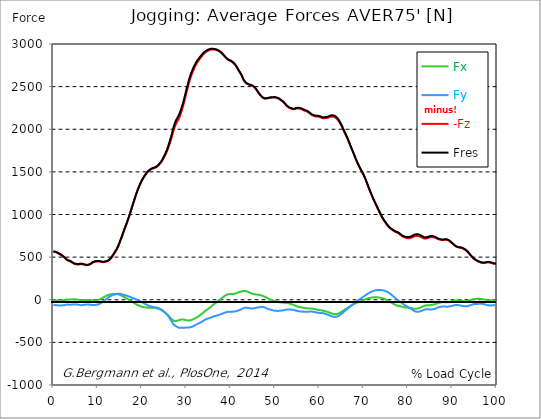
| Category |  Fx |  Fy |  -Fz |  Fres |
|---|---|---|---|---|
| 0.0 | -3.887 | -58.917 | 563.54 | 567.454 |
| 0.167348456675344 | -5.373 | -60.73 | 562.452 | 566.584 |
| 0.334696913350688 | -6.86 | -62.551 | 561.365 | 565.705 |
| 0.5020453700260321 | -7.92 | -64.128 | 559.099 | 563.694 |
| 0.669393826701376 | -8.663 | -65.414 | 556.127 | 560.93 |
| 0.83674228337672 | -8.5 | -65.849 | 551.452 | 556.345 |
| 1.0040907400520642 | -8.182 | -65.723 | 546.169 | 551.098 |
| 1.1621420602454444 | -8.119 | -66.013 | 541.221 | 546.25 |
| 1.3294905169207885 | -8.128 | -66.339 | 536.482 | 541.62 |
| 1.4968389735961325 | -7.847 | -66.339 | 531.571 | 536.763 |
| 1.6641874302714765 | -7.394 | -66.23 | 526.279 | 531.516 |
| 1.8315358869468206 | -6.86 | -66.185 | 520.489 | 525.781 |
| 1.9988843436221646 | -6.252 | -66.067 | 514.245 | 519.601 |
| 2.1662328002975086 | -5.564 | -65.732 | 506.779 | 512.152 |
| 2.333581256972853 | -4.73 | -64.807 | 500.554 | 505.882 |
| 2.5009297136481967 | -3.833 | -63.874 | 494.419 | 499.675 |
| 2.6682781703235405 | -2.138 | -61.799 | 486.445 | 491.519 |
| 2.8356266269988843 | 0.734 | -58.664 | 476.586 | 481.398 |
| 3.002975083674229 | 2.637 | -56.743 | 468.857 | 473.541 |
| 3.1703235403495724 | 3.516 | -56.09 | 463.202 | 467.842 |
| 3.337671997024917 | 3.851 | -56.036 | 458.898 | 463.574 |
| 3.4957233172182973 | 3.588 | -56.552 | 455.69 | 460.457 |
| 3.663071773893641 | 2.456 | -58.147 | 453.996 | 458.989 |
| 3.8304202305689854 | 2.365 | -58.446 | 450.244 | 455.319 |
| 3.997768687244329 | 3.262 | -57.504 | 444.962 | 449.955 |
| 4.165117143919673 | 4.06 | -56.833 | 439.226 | 444.164 |
| 4.332465600595017 | 5.518 | -55.773 | 432.919 | 437.803 |
| 4.499814057270361 | 6.415 | -54.785 | 427.464 | 432.248 |
| 4.667162513945706 | 6.579 | -54.169 | 423.359 | 428.089 |
| 4.834510970621049 | 6.216 | -54.124 | 420.296 | 425.008 |
| 5.001859427296393 | 5.555 | -54.459 | 417.814 | 422.544 |
| 5.169207883971737 | 4.73 | -55.166 | 415.757 | 420.559 |
| 5.336556340647081 | 3.715 | -56.108 | 414.425 | 419.336 |
| 5.503904797322425 | 2.501 | -57.033 | 413.808 | 418.792 |
| 5.671253253997769 | 1.124 | -58.473 | 413.645 | 418.819 |
| 5.82930457419115 | -0.661 | -60.449 | 414.923 | 420.378 |
| 5.996653030866494 | -2.664 | -62.578 | 416.926 | 422.707 |
| 6.164001487541838 | -4.395 | -63.792 | 417.768 | 423.704 |
| 6.331349944217181 | -5.464 | -64.019 | 417.442 | 423.405 |
| 6.498698400892526 | -5.754 | -63.303 | 416.627 | 422.471 |
| 6.66604685756787 | -5.808 | -62.243 | 415.648 | 421.329 |
| 6.833395314243213 | -5.319 | -60.802 | 413.219 | 418.693 |
| 7.000743770918558 | -4.214 | -58.836 | 409.405 | 414.633 |
| 7.168092227593902 | -3.407 | -57.377 | 406.677 | 411.697 |
| 7.335440684269246 | -3.108 | -56.58 | 405.626 | 410.555 |
| 7.50278914094459 | -3.081 | -56.099 | 405.889 | 410.709 |
| 7.6701375976199335 | -2.727 | -55.664 | 405.871 | 410.592 |
| 7.837486054295278 | -2.637 | -55.673 | 406.895 | 411.607 |
| 7.995537374488658 | -2.882 | -56.344 | 408.997 | 413.818 |
| 8.162885831164003 | -3.307 | -57.15 | 411.797 | 416.781 |
| 8.330234287839346 | -4.513 | -58.338 | 415.929 | 421.112 |
| 8.49758274451469 | -6.107 | -60.014 | 421.184 | 426.612 |
| 8.664931201190035 | -7.938 | -61.826 | 428.189 | 433.798 |
| 8.832279657865378 | -9.551 | -63.403 | 435.139 | 440.875 |
| 8.999628114540721 | -9.288 | -63.312 | 439.371 | 445.089 |
| 9.166976571216066 | -8.164 | -62.189 | 442.506 | 448.124 |
| 9.334325027891412 | -7.53 | -60.82 | 445.025 | 450.489 |
| 9.501673484566755 | -7.385 | -59.987 | 447.082 | 452.374 |
| 9.669021941242098 | -6.669 | -59.407 | 448.523 | 453.679 |
| 9.836370397917442 | -5.21 | -57.83 | 449.112 | 454.077 |
| 10.003718854592787 | -3.172 | -55.547 | 449.157 | 453.905 |
| 10.17106731126813 | -0.544 | -52.167 | 449.692 | 454.159 |
| 10.329118631461512 | 1.803 | -49.466 | 449.474 | 453.679 |
| 10.496467088136853 | 4.703 | -46.204 | 448.722 | 452.637 |
| 10.663815544812199 | 8.463 | -41.927 | 447.29 | 450.997 |
| 10.831164001487544 | 13.556 | -36.146 | 444.753 | 448.414 |
| 10.998512458162887 | 18.676 | -29.948 | 442.805 | 446.529 |
| 11.16586091483823 | 24.085 | -22.808 | 441.663 | 445.777 |
| 11.333209371513574 | 29.866 | -14.969 | 441.102 | 445.931 |
| 11.50055782818892 | 34.234 | -8.88 | 442.388 | 447.408 |
| 11.667906284864264 | 38.448 | -2.646 | 443.965 | 449.103 |
| 11.835254741539607 | 42.779 | 3.942 | 445.877 | 451.441 |
| 12.00260319821495 | 46.875 | 10.475 | 448.151 | 454.259 |
| 12.169951654890292 | 51.007 | 17.244 | 450.498 | 457.412 |
| 12.337300111565641 | 54.876 | 23.668 | 453.724 | 461.463 |
| 12.504648568240984 | 57.631 | 29.06 | 459.188 | 467.461 |
| 12.662699888434362 | 60.748 | 35.131 | 465.767 | 474.448 |
| 12.830048345109708 | 63.403 | 40.804 | 473.732 | 482.703 |
| 12.997396801785053 | 64.762 | 45.217 | 484.152 | 493.386 |
| 13.164745258460396 | 66.411 | 50.309 | 495.452 | 505.048 |
| 13.33209371513574 | 67.281 | 54.088 | 507.449 | 517.272 |
| 13.499442171811083 | 67.336 | 56.498 | 520.271 | 530.157 |
| 13.666790628486426 | 66.91 | 58.51 | 534.543 | 544.275 |
| 13.834139085161771 | 66.529 | 60.53 | 548.579 | 558.175 |
| 14.001487541837117 | 66.293 | 62.759 | 562.697 | 572.148 |
| 14.16883599851246 | 66.402 | 65.405 | 576.742 | 586.121 |
| 14.336184455187803 | 66.375 | 68.495 | 591.548 | 600.891 |
| 14.503532911863147 | 65.605 | 70.471 | 608.738 | 617.926 |
| 14.670881368538492 | 63.648 | 71.268 | 628.274 | 637.127 |
| 14.828932688731873 | 60.585 | 70.851 | 650.847 | 659.21 |
| 14.996281145407215 | 57.576 | 70.398 | 673.953 | 681.8 |
| 15.163629602082558 | 53.562 | 68.595 | 697.694 | 704.735 |
| 15.330978058757903 | 49.403 | 66.23 | 721.027 | 727.452 |
| 15.498326515433247 | 44.918 | 63.711 | 745.394 | 751.211 |
| 15.665674972108594 | 40.26 | 60.866 | 770.222 | 775.387 |
| 15.833023428783937 | 35.34 | 57.676 | 795.385 | 799.853 |
| 16.00037188545928 | 30.193 | 54.432 | 820.54 | 824.346 |
| 16.167720342134626 | 25.734 | 52.303 | 844.589 | 848.023 |
| 16.335068798809967 | 22.101 | 51.387 | 866.925 | 870.16 |
| 16.502417255485312 | 17.706 | 49.258 | 890.059 | 893.122 |
| 16.669765712160658 | 12.731 | 46.367 | 914 | 916.872 |
| 16.837114168836 | 7.177 | 43.132 | 939.517 | 942.099 |
| 17.004462625511344 | 1.64 | 39.372 | 964.707 | 967.1 |
| 17.16251394570472 | -3.951 | 35.711 | 989.862 | 992.127 |
| 17.32986240238007 | -9.705 | 32.041 | 1015.941 | 1018.115 |
| 17.497210859055414 | -15.685 | 28.652 | 1043.759 | 1045.853 |
| 17.664559315730756 | -20.823 | 25.662 | 1072.212 | 1074.305 |
| 17.8319077724061 | -26.088 | 22.672 | 1100.837 | 1102.949 |
| 17.999256229081443 | -31.588 | 19.201 | 1128.583 | 1130.785 |
| 18.166604685756788 | -36.962 | 15.731 | 1155.722 | 1157.961 |
| 18.333953142432133 | -42.326 | 12.45 | 1182.626 | 1184.936 |
| 18.501301599107478 | -47.518 | 8.744 | 1208.931 | 1211.323 |
| 18.668650055782823 | -52.629 | 4.549 | 1235.291 | 1237.783 |
| 18.835998512458165 | -57.703 | 0.362 | 1260.563 | 1263.2 |
| 19.00334696913351 | -62.334 | -3.579 | 1283.86 | 1286.651 |
| 19.170695425808855 | -66.04 | -6.914 | 1305.29 | 1308.263 |
| 19.338043882484197 | -69.764 | -11.381 | 1325.597 | 1328.769 |
| 19.496095202677576 | -73.271 | -15.803 | 1346.003 | 1349.365 |
| 19.66344365935292 | -76.696 | -20.515 | 1365.395 | 1369.001 |
| 19.830792116028263 | -80.167 | -24.792 | 1383.581 | 1387.342 |
| 19.998140572703612 | -83.057 | -29.259 | 1400.562 | 1404.513 |
| 20.165489029378953 | -84.915 | -33.509 | 1415.622 | 1419.709 |
| 20.3328374860543 | -86.727 | -37.913 | 1429.867 | 1434.135 |
| 20.500185942729644 | -88.113 | -41.755 | 1444.211 | 1448.633 |
| 20.667534399404985 | -89.409 | -46.358 | 1457.722 | 1462.325 |
| 20.83488285608033 | -90.805 | -52.212 | 1470.399 | 1475.283 |
| 21.002231312755672 | -91.883 | -57.613 | 1482.632 | 1487.742 |
| 21.16957976943102 | -92.264 | -61.998 | 1492.962 | 1498.145 |
| 21.336928226106362 | -92.381 | -66.058 | 1501.824 | 1507.043 |
| 21.504276682781704 | -92.372 | -69.311 | 1509.327 | 1514.628 |
| 21.67162513945705 | -92.399 | -72.392 | 1516.503 | 1521.931 |
| 21.82967645965043 | -92.925 | -75.436 | 1523.299 | 1528.827 |
| 21.997024916325774 | -93.097 | -78.563 | 1529.18 | 1534.807 |
| 22.16437337300112 | -92.825 | -81.335 | 1534.083 | 1539.773 |
| 22.33172182967646 | -92.807 | -82.994 | 1538.115 | 1543.869 |
| 22.499070286351806 | -93.297 | -84.724 | 1540.752 | 1546.633 |
| 22.666418743027148 | -93.931 | -86.183 | 1542.917 | 1548.907 |
| 22.833767199702496 | -94.728 | -87.524 | 1545.246 | 1551.345 |
| 23.00111565637784 | -96.423 | -88.295 | 1549.17 | 1555.413 |
| 23.168464113053183 | -98.779 | -90.288 | 1553.791 | 1560.279 |
| 23.335812569728528 | -101.434 | -92.2 | 1558.712 | 1565.471 |
| 23.50316102640387 | -104.206 | -93.659 | 1564.828 | 1571.878 |
| 23.670509483079215 | -106.599 | -96.93 | 1573.618 | 1580.994 |
| 23.83785793975456 | -109.381 | -101.615 | 1582.86 | 1590.617 |
| 23.995909259947936 | -112.307 | -106.01 | 1592.529 | 1600.693 |
| 24.163257716623285 | -115.832 | -109.462 | 1602.17 | 1610.724 |
| 24.330606173298627 | -120.626 | -113.839 | 1613.769 | 1622.939 |
| 24.49795462997397 | -125.709 | -119.194 | 1627.361 | 1637.211 |
| 24.665303086649313 | -131.21 | -125.8 | 1641.805 | 1652.543 |
| 24.83265154332466 | -137.19 | -133.448 | 1657.282 | 1669.053 |
| 25.0 | -143.624 | -141.458 | 1673.746 | 1686.632 |
| 25.167348456675345 | -150.465 | -148.888 | 1690.592 | 1704.637 |
| 25.334696913350694 | -157.506 | -156.428 | 1707.292 | 1722.551 |
| 25.502045370026035 | -165.154 | -164.846 | 1726.067 | 1742.713 |
| 25.669393826701377 | -172.983 | -174.251 | 1746.464 | 1764.633 |
| 25.836742283376722 | -180.912 | -185.397 | 1768.583 | 1788.509 |
| 26.004090740052067 | -189.493 | -197.449 | 1793.348 | 1815.195 |
| 26.17143919672741 | -198.708 | -211.557 | 1820.152 | 1844.274 |
| 26.329490516920792 | -208.495 | -225.195 | 1845.841 | 1872.282 |
| 26.49683897359613 | -218.226 | -238.733 | 1873.315 | 1902.14 |
| 26.66418743027148 | -227.324 | -253.186 | 1901.533 | 1932.876 |
| 26.831535886946828 | -234.782 | -267.783 | 1931.309 | 1964.999 |
| 26.998884343622166 | -240.527 | -280.814 | 1967.373 | 2002.975 |
| 27.166232800297514 | -247.431 | -291.66 | 1996.116 | 2033.476 |
| 27.333581256972852 | -250.395 | -299.435 | 2021.742 | 2060.09 |
| 27.5009297136482 | -251.065 | -305.805 | 2044.232 | 2083.16 |
| 27.668278170323543 | -250.313 | -310.807 | 2062.89 | 2102.126 |
| 27.835626626998888 | -248.736 | -315.501 | 2080.478 | 2119.922 |
| 28.002975083674233 | -245.184 | -320.829 | 2095.638 | 2135.191 |
| 28.170323540349575 | -241.514 | -326.058 | 2110.743 | 2150.378 |
| 28.33767199702492 | -238.678 | -327.997 | 2128.83 | 2168.156 |
| 28.50502045370026 | -236.268 | -329.193 | 2149.535 | 2188.436 |
| 28.663071773893645 | -234.075 | -328.83 | 2173.648 | 2211.851 |
| 28.830420230568986 | -232.834 | -330.48 | 2199.101 | 2237.023 |
| 28.99776868724433 | -232.054 | -329.827 | 2227.681 | 2264.969 |
| 29.165117143919673 | -231.311 | -329.465 | 2255.681 | 2292.416 |
| 29.33246560059502 | -232.589 | -329.99 | 2286.508 | 2322.944 |
| 29.499814057270367 | -234.021 | -329.039 | 2319.754 | 2355.683 |
| 29.66716251394571 | -235.806 | -328.377 | 2354.224 | 2389.681 |
| 29.834510970621054 | -237.917 | -326.692 | 2390.062 | 2424.903 |
| 30.00185942729639 | -240.11 | -325.278 | 2426.108 | 2460.378 |
| 30.169207883971744 | -241.487 | -325.034 | 2459.789 | 2493.634 |
| 30.33655634064708 | -242.874 | -324.372 | 2494.205 | 2527.578 |
| 30.50390479732243 | -243.78 | -324.245 | 2528.176 | 2561.169 |
| 30.671253253997772 | -243.816 | -324.227 | 2559.891 | 2592.467 |
| 30.829304574191156 | -241.46 | -323.076 | 2587.701 | 2619.561 |
| 30.996653030866494 | -239.032 | -321.201 | 2613.888 | 2645.023 |
| 31.164001487541842 | -236.213 | -318.455 | 2638.091 | 2668.42 |
| 31.331349944217187 | -232.96 | -315.528 | 2661.026 | 2690.457 |
| 31.498698400892525 | -229.553 | -312.275 | 2682.039 | 2710.619 |
| 31.666046857567874 | -226.028 | -308.17 | 2702.201 | 2729.866 |
| 31.833395314243212 | -222.204 | -302.842 | 2722.018 | 2748.605 |
| 32.00074377091856 | -217.221 | -296.889 | 2739.516 | 2764.888 |
| 32.1680922275939 | -211.757 | -292.965 | 2756.66 | 2780.999 |
| 32.33544068426925 | -207.09 | -288.942 | 2771.902 | 2795.38 |
| 32.50278914094459 | -201.943 | -284.792 | 2786.345 | 2808.945 |
| 32.670137597619934 | -196.842 | -280.923 | 2799.294 | 2821.069 |
| 32.83748605429528 | -190.743 | -276.845 | 2811.273 | 2832.16 |
| 33.004834510970625 | -184.699 | -272.224 | 2823.561 | 2843.55 |
| 33.162885831164004 | -177.767 | -267.285 | 2835.721 | 2854.687 |
| 33.33023428783935 | -170.835 | -262.473 | 2847.429 | 2865.434 |
| 33.497582744514695 | -164.03 | -257.807 | 2858.42 | 2875.582 |
| 33.664931201190036 | -157.551 | -253.213 | 2869.004 | 2885.36 |
| 33.83227965786538 | -150.936 | -248.301 | 2879.243 | 2894.738 |
| 33.99962811454073 | -143.125 | -241.487 | 2888.332 | 2902.875 |
| 34.16697657121607 | -135.115 | -234.863 | 2895.989 | 2909.617 |
| 34.33432502789141 | -128.165 | -229.861 | 2902.866 | 2915.752 |
| 34.50167348456676 | -122.674 | -227.197 | 2909.78 | 2922.158 |
| 34.6690219412421 | -116.648 | -223.79 | 2915.181 | 2927.06 |
| 34.83637039791744 | -110.241 | -220.637 | 2920.183 | 2931.555 |
| 35.00371885459279 | -104.216 | -218.154 | 2924.405 | 2935.37 |
| 35.17106731126814 | -98.289 | -216.731 | 2928.247 | 2938.858 |
| 35.338415767943474 | -90.732 | -213.37 | 2931.736 | 2941.767 |
| 35.49646708813686 | -83.22 | -209.962 | 2933.956 | 2943.498 |
| 35.6638155448122 | -75.935 | -206.51 | 2934.844 | 2943.96 |
| 35.831164001487544 | -68.604 | -202.668 | 2934.953 | 2943.643 |
| 35.998512458162885 | -61.047 | -198.699 | 2934.998 | 2943.262 |
| 36.165860914838234 | -53.671 | -194.785 | 2934.98 | 2942.845 |
| 36.333209371513576 | -48.162 | -191.831 | 2934.482 | 2942.084 |
| 36.50055782818892 | -42.562 | -189.71 | 2933.204 | 2940.562 |
| 36.667906284864266 | -36.228 | -188.242 | 2931.211 | 2938.324 |
| 36.83525474153961 | -28.833 | -185.533 | 2928.365 | 2935.152 |
| 37.002603198214956 | -21.512 | -182.724 | 2924.65 | 2931.202 |
| 37.1699516548903 | -14.68 | -180.359 | 2920.699 | 2927.106 |
| 37.337300111565646 | -8.599 | -177.523 | 2916.305 | 2922.611 |
| 37.50464856824098 | -1.658 | -174.704 | 2911.312 | 2917.455 |
| 37.66269988843437 | 5.446 | -171.578 | 2905.05 | 2911.013 |
| 37.83004834510971 | 12.296 | -168.081 | 2897.683 | 2903.492 |
| 37.99739680178505 | 18.92 | -165.48 | 2889.573 | 2895.291 |
| 38.16474525846039 | 25.644 | -162.426 | 2880.693 | 2886.329 |
| 38.33209371513574 | 32.503 | -158.738 | 2871.333 | 2876.869 |
| 38.49944217181109 | 39 | -155.268 | 2861.737 | 2867.192 |
| 38.666790628486424 | 45.235 | -152.033 | 2851.769 | 2857.17 |
| 38.83413908516178 | 51.261 | -148.807 | 2841.847 | 2847.211 |
| 39.001487541837115 | 56.688 | -146.188 | 2832.686 | 2838.05 |
| 39.16883599851246 | 60.63 | -143.941 | 2824.476 | 2829.858 |
| 39.336184455187805 | 62.986 | -141.929 | 2817.616 | 2822.999 |
| 39.503532911863154 | 65.759 | -140.778 | 2811.754 | 2817.191 |
| 39.670881368538495 | 67.127 | -141.023 | 2807.431 | 2812.914 |
| 39.83822982521384 | 66.529 | -142.455 | 2804.468 | 2809.987 |
| 39.996281145407224 | 65.94 | -143.216 | 2800.989 | 2806.534 |
| 40.163629602082565 | 65.877 | -142.011 | 2795.778 | 2801.27 |
| 40.33097805875791 | 67.118 | -140.271 | 2789.426 | 2794.854 |
| 40.498326515433256 | 67.97 | -139.184 | 2782.666 | 2788.094 |
| 40.6656749721086 | 69.302 | -139.147 | 2774.819 | 2780.229 |
| 40.83302342878393 | 70.389 | -138.794 | 2765.667 | 2771.023 |
| 41.00037188545929 | 72.22 | -137.571 | 2755.419 | 2760.747 |
| 41.16772034213463 | 74.829 | -135.613 | 2744.065 | 2749.384 |
| 41.33506879880997 | 77.566 | -132.913 | 2731.107 | 2736.399 |
| 41.50241725548531 | 81.607 | -129.905 | 2716.255 | 2721.511 |
| 41.66976571216066 | 85.658 | -126.643 | 2700.398 | 2705.59 |
| 41.837114168836 | 88.983 | -123.19 | 2685.12 | 2690.24 |
| 42.004462625511344 | 91.493 | -119.991 | 2671.102 | 2676.177 |
| 42.17181108218669 | 93.378 | -116.92 | 2657.437 | 2662.448 |
| 42.32986240238007 | 95.036 | -113.866 | 2643.737 | 2648.675 |
| 42.497210859055414 | 96.74 | -110.54 | 2627.77 | 2632.636 |
| 42.66455931573076 | 100.056 | -105.185 | 2606.748 | 2611.505 |
| 42.831907772406105 | 103.346 | -100.056 | 2586.033 | 2590.7 |
| 42.999256229081446 | 104.061 | -96.83 | 2570.72 | 2575.305 |
| 43.16660468575679 | 103.744 | -94.592 | 2558.777 | 2563.262 |
| 43.33395314243214 | 103.518 | -92.064 | 2547.812 | 2552.189 |
| 43.50130159910748 | 101.198 | -92.191 | 2540.128 | 2544.414 |
| 43.66865005578282 | 98.19 | -93.632 | 2533.912 | 2538.144 |
| 43.83599851245817 | 94.411 | -96.187 | 2529.363 | 2533.55 |
| 44.00334696913351 | 91.122 | -97.41 | 2524.932 | 2529.073 |
| 44.17069542580886 | 87.153 | -98.924 | 2521.915 | 2526.065 |
| 44.3380438824842 | 82.976 | -100.256 | 2519.341 | 2523.473 |
| 44.49609520267758 | 78.735 | -101.144 | 2516.904 | 2521.018 |
| 44.66344365935292 | 74.657 | -102.177 | 2514.367 | 2518.444 |
| 44.83079211602827 | 71.141 | -103.79 | 2511.567 | 2515.726 |
| 44.99814057270361 | 68.423 | -103.028 | 2507.063 | 2511.168 |
| 45.16548902937895 | 66.457 | -101.425 | 2500.412 | 2504.381 |
| 45.332837486054295 | 64.717 | -99.096 | 2492.483 | 2496.307 |
| 45.500185942729644 | 63.376 | -97.057 | 2483.313 | 2487.037 |
| 45.66753439940499 | 62.279 | -95.435 | 2472.956 | 2476.589 |
| 45.83488285608033 | 61.128 | -93.913 | 2461.52 | 2465.072 |
| 46.00223131275568 | 60.24 | -92.218 | 2448.327 | 2451.797 |
| 46.16957976943102 | 59.407 | -90.478 | 2434.816 | 2438.196 |
| 46.336928226106366 | 57.948 | -89.183 | 2422.774 | 2426.081 |
| 46.50427668278171 | 56.552 | -87.552 | 2411.139 | 2414.355 |
| 46.671625139457056 | 54.432 | -85.866 | 2400.356 | 2403.482 |
| 46.829676459650436 | 52.04 | -84.362 | 2390.107 | 2393.143 |
| 46.99702491632577 | 49.729 | -83.338 | 2380.964 | 2383.927 |
| 47.16437337300112 | 46.748 | -83.836 | 2373.688 | 2376.606 |
| 47.33172182967646 | 43.441 | -85.023 | 2367.281 | 2370.163 |
| 47.49907028635181 | 39.544 | -87.271 | 2363.013 | 2365.922 |
| 47.66641874302716 | 35.548 | -90.016 | 2360.059 | 2363.032 |
| 47.83376719970249 | 31.869 | -93.387 | 2358.682 | 2361.826 |
| 48.001115656377834 | 27.338 | -97.7 | 2359.615 | 2362.995 |
| 48.16846411305319 | 22.264 | -102.367 | 2360.875 | 2364.49 |
| 48.33581256972853 | 17.353 | -106.173 | 2363.104 | 2366.937 |
| 48.50316102640387 | 12.985 | -109.063 | 2365.07 | 2369.112 |
| 48.67050948307921 | 9.098 | -111.256 | 2366.611 | 2370.824 |
| 48.837857939754564 | 5.537 | -114.038 | 2368.332 | 2372.8 |
| 49.005206396429905 | 1.975 | -116.82 | 2369.737 | 2374.467 |
| 49.163257716623285 | -1.83 | -119.547 | 2370.67 | 2375.654 |
| 49.33060617329863 | -5.917 | -122.202 | 2371.123 | 2376.343 |
| 49.49795462997397 | -9.324 | -123.779 | 2370.87 | 2376.225 |
| 49.66530308664932 | -12.804 | -125.519 | 2371.151 | 2376.696 |
| 49.832651543324666 | -16.211 | -127.195 | 2372.057 | 2377.811 |
| 50.0 | -18.712 | -128.292 | 2371.413 | 2377.321 |
| 50.16734845667534 | -20.696 | -129.044 | 2369.809 | 2375.817 |
| 50.33469691335069 | -22.327 | -129.823 | 2367.182 | 2373.289 |
| 50.50204537002604 | -24.14 | -131.155 | 2364.074 | 2370.317 |
| 50.66939382670139 | -26.287 | -131.871 | 2361.745 | 2368.097 |
| 50.836742283376715 | -27.918 | -131.364 | 2357.848 | 2364.2 |
| 51.00409074005207 | -28.707 | -129.696 | 2352.33 | 2358.564 |
| 51.17143919672741 | -29.812 | -128.672 | 2346.295 | 2352.457 |
| 51.32949051692079 | -30.718 | -127.739 | 2339.544 | 2345.652 |
| 51.496838973596134 | -32.377 | -127.041 | 2332.83 | 2338.856 |
| 51.66418743027148 | -33.21 | -126.543 | 2327.157 | 2333.12 |
| 51.831535886946824 | -33.473 | -124.839 | 2320.144 | 2325.943 |
| 51.99888434362217 | -34.18 | -122.964 | 2312.306 | 2317.96 |
| 52.16623280029752 | -34.642 | -120.78 | 2303.081 | 2308.59 |
| 52.33358125697285 | -35.439 | -118.551 | 2291.627 | 2297.01 |
| 52.5009297136482 | -36.336 | -116.748 | 2281.75 | 2287.024 |
| 52.668278170323546 | -37.56 | -115.153 | 2272.544 | 2277.718 |
| 52.835626626998895 | -38.991 | -114.056 | 2264.09 | 2269.173 |
| 53.00297508367424 | -40.668 | -113.349 | 2257.466 | 2262.486 |
| 53.17032354034958 | -43.069 | -113.531 | 2252.274 | 2257.285 |
| 53.33767199702492 | -45.851 | -113.984 | 2248.567 | 2253.597 |
| 53.50502045370027 | -48.678 | -114.763 | 2246.148 | 2251.222 |
| 53.663071773893655 | -51.342 | -115.642 | 2241.998 | 2247.163 |
| 53.83042023056899 | -54.07 | -116.63 | 2238.319 | 2243.584 |
| 53.99776868724433 | -56.815 | -117.599 | 2235.809 | 2241.182 |
| 54.16511714391967 | -59.697 | -118.814 | 2234.731 | 2240.24 |
| 54.33246560059503 | -63.203 | -120.789 | 2235.727 | 2241.391 |
| 54.49981405727037 | -66.438 | -122.61 | 2237.83 | 2243.665 |
| 54.667162513945705 | -71.087 | -126.57 | 2241.672 | 2247.843 |
| 54.834510970621054 | -74.766 | -129.415 | 2244.254 | 2250.67 |
| 55.0018594272964 | -77.62 | -131.318 | 2245.052 | 2251.657 |
| 55.169207883971744 | -80.302 | -132.904 | 2244.608 | 2251.413 |
| 55.336556340647086 | -82.831 | -134.553 | 2244.01 | 2251.005 |
| 55.50390479732243 | -85.078 | -136.193 | 2243.14 | 2250.316 |
| 55.671253253997776 | -87.008 | -136.882 | 2241.962 | 2249.238 |
| 55.83860171067312 | -88.666 | -137.226 | 2239.515 | 2246.882 |
| 55.9966530308665 | -90.279 | -137.743 | 2235.791 | 2243.23 |
| 56.16400148754184 | -91.81 | -138.876 | 2231.586 | 2239.162 |
| 56.33134994421718 | -93.088 | -139.764 | 2227.146 | 2234.821 |
| 56.498698400892536 | -94.139 | -139.927 | 2222.126 | 2229.874 |
| 56.66604685756788 | -95.589 | -140.407 | 2218.629 | 2226.449 |
| 56.83339531424321 | -97.166 | -141.059 | 2216.254 | 2224.228 |
| 57.00074377091856 | -98.561 | -141.585 | 2213.491 | 2221.573 |
| 57.16809222759391 | -99.984 | -141.648 | 2210.084 | 2218.23 |
| 57.33544068426925 | -101.026 | -141.286 | 2205.952 | 2214.116 |
| 57.5027891409446 | -101.606 | -140.824 | 2199.899 | 2208.063 |
| 57.670137597619934 | -101.597 | -140.235 | 2193.157 | 2201.321 |
| 57.83748605429528 | -101.406 | -139.582 | 2186.089 | 2194.235 |
| 58.004834510970625 | -101.579 | -138.903 | 2179.556 | 2187.693 |
| 58.16288583116401 | -101.977 | -138.359 | 2173.14 | 2181.268 |
| 58.330234287839346 | -103.038 | -138.549 | 2166.29 | 2174.454 |
| 58.497582744514695 | -104.578 | -140.09 | 2161.777 | 2170.059 |
| 58.66493120119004 | -106.68 | -141.73 | 2158.542 | 2166.897 |
| 58.832279657865385 | -108.203 | -142.953 | 2155.434 | 2163.907 |
| 58.999628114540734 | -109.797 | -144.457 | 2152.788 | 2161.415 |
| 59.16697657121607 | -111.945 | -146.56 | 2150.94 | 2159.784 |
| 59.33432502789142 | -114.31 | -148.707 | 2149.843 | 2158.886 |
| 59.50167348456676 | -116.258 | -150.13 | 2149.29 | 2158.488 |
| 59.66902194124211 | -118.188 | -151.598 | 2148.538 | 2157.899 |
| 59.83637039791745 | -120.028 | -153.211 | 2146.889 | 2156.449 |
| 60.00371885459278 | -121.478 | -154.189 | 2145.022 | 2154.727 |
| 60.17106731126813 | -122.891 | -155.041 | 2142.839 | 2152.67 |
| 60.33841576794349 | -124.078 | -155.132 | 2138.843 | 2148.783 |
| 60.49646708813685 | -125.039 | -155.485 | 2134.765 | 2144.787 |
| 60.6638155448122 | -125.954 | -155.902 | 2130.66 | 2140.773 |
| 60.831164001487544 | -127.866 | -157.352 | 2128.449 | 2138.752 |
| 60.99851245816289 | -130.077 | -159.472 | 2128.15 | 2138.707 |
| 61.16586091483824 | -132.397 | -162.163 | 2129.428 | 2140.274 |
| 61.333209371513576 | -134.744 | -165.099 | 2130.905 | 2142.041 |
| 61.50055782818892 | -137.045 | -167.809 | 2131.811 | 2143.246 |
| 61.667906284864266 | -139.528 | -170.282 | 2132.835 | 2144.578 |
| 61.835254741539615 | -142.301 | -173.037 | 2134.221 | 2146.336 |
| 62.002603198214956 | -145.49 | -176.825 | 2136.396 | 2148.982 |
| 62.16995165489029 | -148.907 | -180.477 | 2139.649 | 2152.707 |
| 62.33730011156564 | -152.296 | -184.536 | 2143.292 | 2156.884 |
| 62.504648568240995 | -155.558 | -188.541 | 2146.726 | 2160.853 |
| 62.67199702491633 | -158.503 | -191.223 | 2148.33 | 2162.883 |
| 62.83004834510971 | -161.602 | -194.531 | 2149.481 | 2164.568 |
| 62.99739680178505 | -163.704 | -196.515 | 2148.366 | 2163.789 |
| 63.1647452584604 | -165.661 | -198.491 | 2146.644 | 2162.411 |
| 63.33209371513575 | -167.519 | -200.647 | 2144.107 | 2160.237 |
| 63.4994421718111 | -168.86 | -201.662 | 2140.211 | 2156.567 |
| 63.666790628486424 | -169.023 | -201.155 | 2134.919 | 2151.293 |
| 63.83413908516177 | -167.936 | -199.56 | 2128.177 | 2144.415 |
| 64.00148754183712 | -165.888 | -196.95 | 2120.013 | 2135.952 |
| 64.16883599851248 | -163.831 | -194.114 | 2109.973 | 2125.595 |
| 64.3361844551878 | -160.877 | -189.855 | 2098.057 | 2113.181 |
| 64.50353291186315 | -156.799 | -183.856 | 2084.855 | 2099.244 |
| 64.6708813685385 | -151.824 | -177.523 | 2070.402 | 2084.003 |
| 64.83822982521384 | -146.351 | -170.962 | 2055.015 | 2067.801 |
| 65.00557828188919 | -140.96 | -164.121 | 2038.243 | 2050.267 |
| 65.16362960208257 | -135.477 | -157.161 | 2021.062 | 2032.325 |
| 65.3309780587579 | -129.669 | -149.813 | 2002.513 | 2012.979 |
| 65.49832651543326 | -123.154 | -141.975 | 1983.077 | 1992.709 |
| 65.6656749721086 | -117.146 | -134.589 | 1964.428 | 1973.263 |
| 65.83302342878395 | -111.845 | -128.237 | 1947.103 | 1955.267 |
| 66.00037188545929 | -106.762 | -121.768 | 1929.741 | 1937.262 |
| 66.16772034213463 | -101.588 | -115.035 | 1911.527 | 1918.441 |
| 66.33506879880998 | -96.069 | -107.777 | 1892.172 | 1898.47 |
| 66.50241725548531 | -90.37 | -100.12 | 1871.766 | 1877.438 |
| 66.66976571216065 | -84.743 | -92.544 | 1851.097 | 1856.189 |
| 66.83711416883601 | -79.233 | -84.987 | 1829.83 | 1834.406 |
| 67.00446262551135 | -73.778 | -77.403 | 1807.629 | 1811.725 |
| 67.1718110821867 | -68.405 | -69.9 | 1786.045 | 1789.669 |
| 67.32986240238007 | -63.756 | -62.841 | 1765.557 | 1768.783 |
| 67.49721085905541 | -59.198 | -55.855 | 1744.471 | 1747.389 |
| 67.66455931573076 | -54.749 | -49.077 | 1722.986 | 1725.641 |
| 67.83190777240611 | -50.228 | -42.217 | 1701.719 | 1704.102 |
| 67.99925622908145 | -45.932 | -35.63 | 1680.28 | 1682.445 |
| 68.16660468575678 | -42 | -29.078 | 1658.233 | 1660.209 |
| 68.33395314243214 | -37.877 | -22.572 | 1637.301 | 1639.086 |
| 68.50130159910749 | -33.718 | -16.03 | 1616.705 | 1618.354 |
| 68.66865005578282 | -29.821 | -9.759 | 1597.44 | 1598.926 |
| 68.83599851245816 | -26.024 | -3.688 | 1579.87 | 1581.193 |
| 69.00334696913352 | -22.237 | 2.356 | 1563.523 | 1564.665 |
| 69.17069542580886 | -18.621 | 8.4 | 1546.515 | 1547.557 |
| 69.3380438824842 | -15.087 | 14.326 | 1529.198 | 1530.24 |
| 69.50539233915956 | -11.753 | 20.035 | 1513.006 | 1514.093 |
| 69.66344365935292 | -8.482 | 25.68 | 1497.157 | 1498.29 |
| 69.83079211602826 | -5.247 | 31.398 | 1480.892 | 1482.106 |
| 69.99814057270362 | -2.084 | 37.242 | 1463.911 | 1465.252 |
| 70.16548902937896 | 0.915 | 43.178 | 1444.284 | 1445.833 |
| 70.33283748605429 | 4.377 | 49.684 | 1423.669 | 1425.508 |
| 70.50018594272964 | 7.584 | 55.991 | 1402.157 | 1404.287 |
| 70.667534399405 | 10.62 | 61.69 | 1379.205 | 1381.651 |
| 70.83488285608033 | 13.873 | 67.526 | 1355.79 | 1358.635 |
| 71.00223131275568 | 16.981 | 73.352 | 1332.438 | 1335.728 |
| 71.16957976943102 | 19.328 | 78.409 | 1310.338 | 1314.062 |
| 71.33692822610637 | 21.548 | 83.284 | 1288.065 | 1292.242 |
| 71.50427668278171 | 23.469 | 87.869 | 1266.172 | 1270.812 |
| 71.67162513945706 | 24.991 | 92.173 | 1244.343 | 1249.381 |
| 71.8389735961324 | 26.178 | 96.106 | 1222.922 | 1228.386 |
| 71.99702491632577 | 27.166 | 99.812 | 1202.362 | 1208.252 |
| 72.16437337300113 | 27.909 | 103.246 | 1182.209 | 1188.461 |
| 72.33172182967647 | 28.38 | 106.155 | 1162.618 | 1169.206 |
| 72.49907028635181 | 28.852 | 108.882 | 1143.281 | 1150.168 |
| 72.66641874302715 | 28.761 | 110.667 | 1124.533 | 1131.61 |
| 72.8337671997025 | 28.571 | 112.235 | 1106.011 | 1113.27 |
| 73.00111565637783 | 28.308 | 113.639 | 1087.553 | 1094.965 |
| 73.16846411305319 | 27.773 | 114.727 | 1068.968 | 1076.507 |
| 73.33581256972853 | 27.202 | 115.18 | 1051.307 | 1058.928 |
| 73.50316102640387 | 26.296 | 115.107 | 1033.801 | 1041.431 |
| 73.67050948307921 | 24.756 | 114.681 | 1015.914 | 1023.516 |
| 73.83785793975457 | 23.224 | 114.147 | 997.474 | 1005.022 |
| 74.00520639642991 | 21.367 | 112.896 | 979.985 | 987.397 |
| 74.16325771662328 | 19.192 | 111.365 | 964.834 | 972.074 |
| 74.33060617329863 | 17.407 | 110.25 | 949.566 | 956.697 |
| 74.49795462997398 | 14.942 | 108.737 | 934.687 | 941.7 |
| 74.66530308664932 | 11.2 | 106.1 | 921.811 | 928.607 |
| 74.83265154332466 | 7.412 | 102.902 | 910.366 | 916.935 |
| 75.00000000000001 | 3.824 | 100.428 | 898.006 | 904.44 |
| 75.16734845667534 | -0.227 | 97.329 | 886.29 | 892.542 |
| 75.3346969133507 | -4.775 | 92.889 | 875.017 | 880.889 |
| 75.50204537002605 | -9.524 | 87.697 | 863.881 | 869.245 |
| 75.66939382670138 | -14.353 | 82.341 | 853.877 | 858.834 |
| 75.83674228337672 | -19.681 | 76.823 | 845.55 | 850.225 |
| 76.00409074005208 | -25.363 | 70.833 | 838.219 | 842.731 |
| 76.17143919672742 | -31.262 | 63.729 | 831.577 | 836.071 |
| 76.33878765340276 | -37.007 | 56.063 | 825.216 | 829.755 |
| 76.49683897359614 | -42.362 | 48.488 | 819.09 | 823.675 |
| 76.66418743027148 | -46.839 | 41.646 | 812.856 | 817.649 |
| 76.83153588694682 | -50.871 | 34.968 | 806.567 | 811.605 |
| 76.99888434362218 | -55.383 | 27.175 | 801.303 | 806.549 |
| 77.16623280029752 | -59.969 | 19.6 | 796.862 | 802.417 |
| 77.33358125697285 | -63.512 | 12.405 | 792.866 | 798.965 |
| 77.5009297136482 | -66.71 | 4.821 | 789.314 | 795.902 |
| 77.66827817032356 | -70.045 | -3.335 | 785.98 | 792.939 |
| 77.83562662699889 | -72.781 | -9.832 | 780.778 | 788 |
| 78.00297508367423 | -74.521 | -15.269 | 775.097 | 782.663 |
| 78.17032354034959 | -76.605 | -21.612 | 768.736 | 776.665 |
| 78.33767199702493 | -76.37 | -25.544 | 760.037 | 768.111 |
| 78.50502045370027 | -78.635 | -31.996 | 753.214 | 761.532 |
| 78.67236891037561 | -82.151 | -38.991 | 746.553 | 755.062 |
| 78.83042023056899 | -84.598 | -46.367 | 741.153 | 750.124 |
| 78.99776868724433 | -86.355 | -52.964 | 736.731 | 746.137 |
| 79.16511714391969 | -88.222 | -59.361 | 732.889 | 742.648 |
| 79.33246560059503 | -89.717 | -64.889 | 729.636 | 739.676 |
| 79.49981405727036 | -90.234 | -69.03 | 727.216 | 737.628 |
| 79.66716251394571 | -90.913 | -74.041 | 725.368 | 736.377 |
| 79.83451097062107 | -92.001 | -79.668 | 723.619 | 735.39 |
| 80.00185942729641 | -93.142 | -85.386 | 721.879 | 734.438 |
| 80.16920788397174 | -93.432 | -89.799 | 721.48 | 734.728 |
| 80.33655634064709 | -94.493 | -95.091 | 722.405 | 736.432 |
| 80.50390479732243 | -95.87 | -100.682 | 724.389 | 739.259 |
| 80.67125325399778 | -97.238 | -106.282 | 726.618 | 742.331 |
| 80.83860171067312 | -98.942 | -112.244 | 729.436 | 746.091 |
| 80.99665303086651 | -100.772 | -118.188 | 732.843 | 750.459 |
| 81.16400148754184 | -102.802 | -124.178 | 737.211 | 755.878 |
| 81.3313499442172 | -104.913 | -130.258 | 741.968 | 761.731 |
| 81.49869840089255 | -105.937 | -134.916 | 744.379 | 764.776 |
| 81.66604685756786 | -105.838 | -137.616 | 746.118 | 766.788 |
| 81.83339531424322 | -105.828 | -140.362 | 747.604 | 768.681 |
| 82.00074377091858 | -104.234 | -140.987 | 748.193 | 769.134 |
| 82.16809222759392 | -101.878 | -140.334 | 748.456 | 769.017 |
| 82.33544068426926 | -100.102 | -140.262 | 747.278 | 767.657 |
| 82.50278914094459 | -97.374 | -138.631 | 744.986 | 764.794 |
| 82.67013759761994 | -94.275 | -136.782 | 741.905 | 761.133 |
| 82.83748605429528 | -90.796 | -133.846 | 738.498 | 756.956 |
| 83.00483451097062 | -87.243 | -131.291 | 734.574 | 752.344 |
| 83.17218296764597 | -83.157 | -127.422 | 729.908 | 746.798 |
| 83.33023428783935 | -78.862 | -122.973 | 724.996 | 740.917 |
| 83.4975827445147 | -75.038 | -119.566 | 720.647 | 735.788 |
| 83.66493120119004 | -71.812 | -117.001 | 717.448 | 732.028 |
| 83.83227965786537 | -69.03 | -114.102 | 716.741 | 730.805 |
| 83.99962811454073 | -66.864 | -112.026 | 717.575 | 731.167 |
| 84.16697657121607 | -65.686 | -111.465 | 719.405 | 732.816 |
| 84.33432502789142 | -64.807 | -111.356 | 721.716 | 735.018 |
| 84.50167348456677 | -64.499 | -112.117 | 724.552 | 737.909 |
| 84.6690219412421 | -64.563 | -113.549 | 728.059 | 741.615 |
| 84.83637039791745 | -64.2 | -114.364 | 731.23 | 744.786 |
| 85.0037188545928 | -63.53 | -114.781 | 733.885 | 747.342 |
| 85.17106731126813 | -62.415 | -114.636 | 735.29 | 748.529 |
| 85.33841576794349 | -60.902 | -114.328 | 736.151 | 749.072 |
| 85.50576422461883 | -59.216 | -112.978 | 735.136 | 747.695 |
| 85.66381554481221 | -57.477 | -111.184 | 733.369 | 745.538 |
| 85.83116400148755 | -55.483 | -109.036 | 731.394 | 743.065 |
| 85.99851245816289 | -53.254 | -106.662 | 728.956 | 740.111 |
| 86.16586091483823 | -50.499 | -103.355 | 725.812 | 736.278 |
| 86.33320937151358 | -48.035 | -100.274 | 722.196 | 732.1 |
| 86.50055782818893 | -44.138 | -95.816 | 717.629 | 726.627 |
| 86.66790628486427 | -40.74 | -92.064 | 713.769 | 722.024 |
| 86.83525474153961 | -38.094 | -89.282 | 710.661 | 718.381 |
| 87.00260319821496 | -35.929 | -87.243 | 708.051 | 715.364 |
| 87.16995165489031 | -33.944 | -85.295 | 705.713 | 712.627 |
| 87.33730011156564 | -31.869 | -82.93 | 703.593 | 710 |
| 87.504648568241 | -30.084 | -80.62 | 701.862 | 707.816 |
| 87.67199702491634 | -28.616 | -78.807 | 700.82 | 706.402 |
| 87.83004834510972 | -28.118 | -78.427 | 700.757 | 706.212 |
| 87.99739680178506 | -27.311 | -77.403 | 701.5 | 706.728 |
| 88.1647452584604 | -27.71 | -78.318 | 702.841 | 708.16 |
| 88.33209371513574 | -28.136 | -79.288 | 703.956 | 709.374 |
| 88.49944217181108 | -28.254 | -79.822 | 704.028 | 709.492 |
| 88.66679062848644 | -28.761 | -80.81 | 703.883 | 709.474 |
| 88.83413908516178 | -28.997 | -81.517 | 702.977 | 708.658 |
| 89.00148754183712 | -28.335 | -81.064 | 699.733 | 705.333 |
| 89.16883599851246 | -27.42 | -80.284 | 695.293 | 700.748 |
| 89.33618445518782 | -25.879 | -78.3 | 689.648 | 694.84 |
| 89.50353291186315 | -24.176 | -76.66 | 682.435 | 687.455 |
| 89.6708813685385 | -22.291 | -75.119 | 674.787 | 679.662 |
| 89.83822982521386 | -20.116 | -72.981 | 667.547 | 672.159 |
| 90.00557828188919 | -18.078 | -70.951 | 660.307 | 664.701 |
| 90.16362960208257 | -15.595 | -68.296 | 652.432 | 656.528 |
| 90.3309780587579 | -13.692 | -66.176 | 644.92 | 648.799 |
| 90.49832651543326 | -11.843 | -64.11 | 637.952 | 641.604 |
| 90.66567497210859 | -10.149 | -62.442 | 631.981 | 635.469 |
| 90.83302342878395 | -9.052 | -61.328 | 626.154 | 629.534 |
| 91.00037188545929 | -8.391 | -60.648 | 620.871 | 624.188 |
| 91.16772034213463 | -8.626 | -60.938 | 617.21 | 620.563 |
| 91.33506879880998 | -9.333 | -61.862 | 614.682 | 618.135 |
| 91.50241725548533 | -10.248 | -63.312 | 613.232 | 616.848 |
| 91.66976571216065 | -11.97 | -65.958 | 612.444 | 616.35 |
| 91.83711416883601 | -13.483 | -68.151 | 611.33 | 615.48 |
| 92.00446262551137 | -14.471 | -69.528 | 609.164 | 613.495 |
| 92.1718110821867 | -15.16 | -71.033 | 605.884 | 610.442 |
| 92.33915953886203 | -16.093 | -72.564 | 602.313 | 607.116 |
| 92.49721085905541 | -16.682 | -73.669 | 598.136 | 603.129 |
| 92.66455931573077 | -16.981 | -74.557 | 593.17 | 598.326 |
| 92.83190777240611 | -17.017 | -75.264 | 587.761 | 593.071 |
| 92.99925622908145 | -16.963 | -75.926 | 582.106 | 587.552 |
| 93.1666046857568 | -16.619 | -76.261 | 575.691 | 581.237 |
| 93.33395314243214 | -15.06 | -74.884 | 567.563 | 572.973 |
| 93.50130159910749 | -12.894 | -73.017 | 558.583 | 563.821 |
| 93.66865005578283 | -10.747 | -71.422 | 549.005 | 554.116 |
| 93.83599851245818 | -8.21 | -68.912 | 538.974 | 543.885 |
| 94.00334696913353 | -4.948 | -65.786 | 528.028 | 532.704 |
| 94.17069542580886 | -1.722 | -62.605 | 517.444 | 521.939 |
| 94.3380438824842 | 1.169 | -59.597 | 507.458 | 511.763 |
| 94.50539233915954 | 3.933 | -56.498 | 497.871 | 501.931 |
| 94.66344365935292 | 6.035 | -54.042 | 489.399 | 493.259 |
| 94.83079211602828 | 7.494 | -52.294 | 481.787 | 485.503 |
| 94.99814057270362 | 8.527 | -50.943 | 475.29 | 478.924 |
| 95.16548902937897 | 9.306 | -49.892 | 469.627 | 473.206 |
| 95.33283748605432 | 9.85 | -49.466 | 464.462 | 468.032 |
| 95.50018594272963 | 10.285 | -48.895 | 459.514 | 463.039 |
| 95.66753439940499 | 10.611 | -48.252 | 454.821 | 458.3 |
| 95.83488285608034 | 10.901 | -47.6 | 450.308 | 453.778 |
| 96.00223131275567 | 10.901 | -46.92 | 446.158 | 449.592 |
| 96.16957976943102 | 10.674 | -46.521 | 442.289 | 445.705 |
| 96.33692822610638 | 10.076 | -46.63 | 438.927 | 442.388 |
| 96.50427668278171 | 9.324 | -47.246 | 436.091 | 439.652 |
| 96.67162513945706 | 8.409 | -48.044 | 433.526 | 437.223 |
| 96.8389735961324 | 7.294 | -48.986 | 431.741 | 435.592 |
| 96.99702491632577 | 6.008 | -50.137 | 431.206 | 435.212 |
| 97.16437337300111 | 4.349 | -52.139 | 431.524 | 435.801 |
| 97.33172182967647 | 2.32 | -55.039 | 432.557 | 437.205 |
| 97.49907028635181 | 0.553 | -56.96 | 433.291 | 438.175 |
| 97.66641874302715 | -1.994 | -59.479 | 435.828 | 441.111 |
| 97.8337671997025 | -4.458 | -61.944 | 438.066 | 443.711 |
| 98.00111565637785 | -6.678 | -64.182 | 439.443 | 445.388 |
| 98.16846411305319 | -7.711 | -64.844 | 438.673 | 444.744 |
| 98.33581256972855 | -8.663 | -66.103 | 437.178 | 443.503 |
| 98.50316102640389 | -9.297 | -66.728 | 435.61 | 442.071 |
| 98.67050948307921 | -9.206 | -66.502 | 433.49 | 439.896 |
| 98.83785793975456 | -8.962 | -66.185 | 430.617 | 436.969 |
| 99.0052063964299 | -8.645 | -65.822 | 427.754 | 434.043 |
| 99.17255485310525 | -8.355 | -65.442 | 425.262 | 431.46 |
| 99.33060617329863 | -8.4 | -65.188 | 423.16 | 429.285 |
| 99.49795462997399 | -8.445 | -64.998 | 421.212 | 427.283 |
| 99.66530308664933 | -8.617 | -65.115 | 419.689 | 425.733 |
| 99.83265154332467 | -8.98 | -65.514 | 418.656 | 424.709 |
| 100.0 | -9.442 | -65.958 | 417.859 | 423.939 |